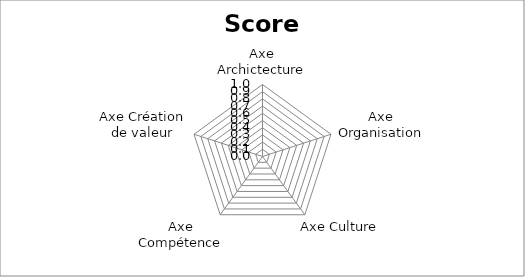
| Category | Score / 2 |
|---|---|
| Axe Archictecture | 0 |
| Axe Organisation | 0 |
| Axe Culture | 0 |
| Axe Compétence | 0 |
| Axe Création de valeur | 0 |